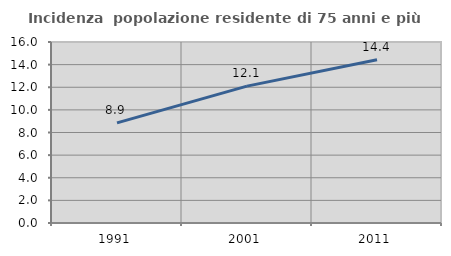
| Category | Incidenza  popolazione residente di 75 anni e più |
|---|---|
| 1991.0 | 8.856 |
| 2001.0 | 12.099 |
| 2011.0 | 14.431 |